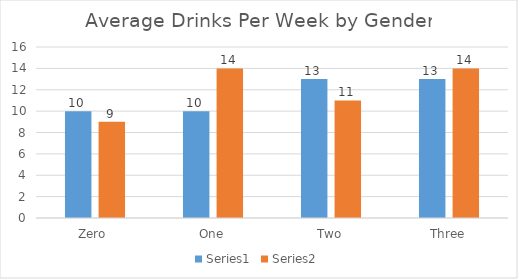
| Category | Series 0 | Series 1 |
|---|---|---|
| Zero  | 10 | 9 |
| One | 10 | 14 |
| Two | 13 | 11 |
| Three | 13 | 14 |